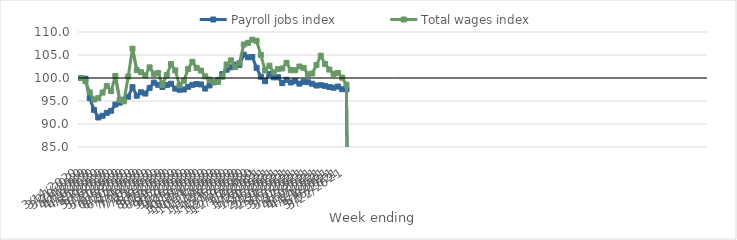
| Category | Payroll jobs index | Total wages index |
|---|---|---|
| 14/03/2020 | 100 | 100 |
| 21/03/2020 | 99.85 | 99.334 |
| 28/03/2020 | 95.629 | 96.875 |
| 04/04/2020 | 93.07 | 95.322 |
| 11/04/2020 | 91.421 | 95.626 |
| 18/04/2020 | 91.793 | 96.829 |
| 25/04/2020 | 92.43 | 98.29 |
| 02/05/2020 | 92.871 | 97.149 |
| 09/05/2020 | 94.226 | 100.437 |
| 16/05/2020 | 94.63 | 95.242 |
| 23/05/2020 | 95.284 | 94.922 |
| 30/05/2020 | 95.93 | 100.324 |
| 06/06/2020 | 98 | 106.379 |
| 13/06/2020 | 96.145 | 101.714 |
| 20/06/2020 | 96.899 | 101.269 |
| 27/06/2020 | 96.616 | 100.562 |
| 04/07/2020 | 97.842 | 102.316 |
| 11/07/2020 | 98.998 | 100.902 |
| 18/07/2020 | 98.528 | 101.104 |
| 25/07/2020 | 98.043 | 98.537 |
| 01/08/2020 | 98.456 | 100.666 |
| 08/08/2020 | 98.758 | 103.024 |
| 15/08/2020 | 97.688 | 101.658 |
| 22/08/2020 | 97.453 | 98.4 |
| 29/08/2020 | 97.499 | 99.397 |
| 05/09/2020 | 98.09 | 101.959 |
| 12/09/2020 | 98.521 | 103.519 |
| 19/09/2020 | 98.691 | 102.198 |
| 26/09/2020 | 98.598 | 101.628 |
| 03/10/2020 | 97.708 | 100.353 |
| 10/10/2020 | 98.383 | 99.668 |
| 17/10/2020 | 99.06 | 99.175 |
| 24/10/2020 | 99.538 | 99.162 |
| 31/10/2020 | 100.85 | 100.271 |
| 07/11/2020 | 101.814 | 102.924 |
| 14/11/2020 | 102.327 | 103.834 |
| 21/11/2020 | 102.911 | 102.394 |
| 28/11/2020 | 102.86 | 103.27 |
| 05/12/2020 | 105.068 | 107.278 |
| 12/12/2020 | 104.504 | 107.649 |
| 19/12/2020 | 104.568 | 108.335 |
| 26/12/2020 | 102.217 | 108.059 |
| 02/01/2021 | 100.285 | 105.012 |
| 09/01/2021 | 99.304 | 101.641 |
| 16/01/2021 | 100.875 | 102.661 |
| 23/01/2021 | 100.14 | 101.212 |
| 30/01/2021 | 100.16 | 101.921 |
| 06/02/2021 | 98.89 | 102.068 |
| 13/02/2021 | 99.603 | 103.305 |
| 20/02/2021 | 99.032 | 101.702 |
| 27/02/2021 | 99.344 | 101.696 |
| 06/03/2021 | 98.776 | 102.498 |
| 13/03/2021 | 99.17 | 102.195 |
| 20/03/2021 | 99.079 | 100.819 |
| 27/03/2021 | 98.752 | 100.985 |
| 03/04/2021 | 98.368 | 102.825 |
| 10/04/2021 | 98.436 | 104.838 |
| 17/04/2021 | 98.289 | 103.06 |
| 24/04/2021 | 98.037 | 101.827 |
| 01/05/2021 | 97.89 | 100.905 |
| 08/05/2021 | 98.14 | 101.087 |
| 15/05/2021 | 97.56 | 100.077 |
| 22/05/2021 | 97.56 | 98.537 |